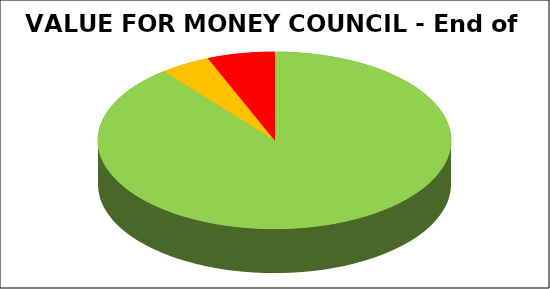
| Category | Series 0 |
|---|---|
| Green | 0.892 |
| Amber | 0.046 |
| Red | 0.062 |